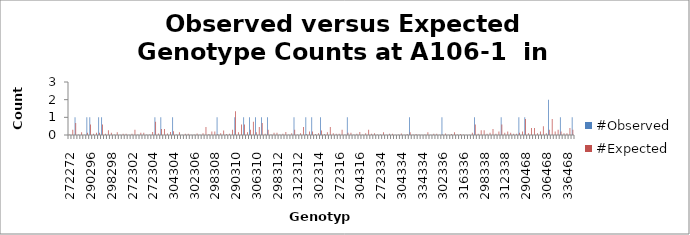
| Category | #Observed | #Expected |
|---|---|---|
| 272272.0 | 0 | 0.033 |
| 272290.0 | 0 | 0.3 |
| 290290.0 | 1 | 0.675 |
| 272294.0 | 0 | 0.033 |
| 290294.0 | 0 | 0.15 |
| 294294.0 | 0 | 0.008 |
| 272296.0 | 1 | 0.133 |
| 290296.0 | 1 | 0.6 |
| 294296.0 | 0 | 0.067 |
| 296296.0 | 0 | 0.133 |
| 272298.0 | 1 | 0.133 |
| 290298.0 | 1 | 0.6 |
| 294298.0 | 0 | 0.067 |
| 296298.0 | 0 | 0.267 |
| 298298.0 | 0 | 0.133 |
| 272300.0 | 0 | 0.033 |
| 290300.0 | 0 | 0.15 |
| 294300.0 | 0 | 0.017 |
| 296300.0 | 0 | 0.067 |
| 298300.0 | 0 | 0.067 |
| 300300.0 | 0 | 0.008 |
| 272302.0 | 0 | 0.067 |
| 290302.0 | 0 | 0.3 |
| 294302.0 | 0 | 0.033 |
| 296302.0 | 0 | 0.133 |
| 298302.0 | 0 | 0.133 |
| 300302.0 | 0 | 0.033 |
| 302302.0 | 0 | 0.033 |
| 272304.0 | 0 | 0.167 |
| 290304.0 | 1 | 0.75 |
| 294304.0 | 0 | 0.083 |
| 296304.0 | 1 | 0.333 |
| 298304.0 | 0 | 0.333 |
| 300304.0 | 0 | 0.083 |
| 302304.0 | 0 | 0.167 |
| 304304.0 | 1 | 0.208 |
| 272306.0 | 0 | 0.033 |
| 290306.0 | 0 | 0.15 |
| 294306.0 | 0 | 0.017 |
| 296306.0 | 0 | 0.067 |
| 298306.0 | 0 | 0.067 |
| 300306.0 | 0 | 0.017 |
| 302306.0 | 0 | 0.033 |
| 304306.0 | 0 | 0.083 |
| 306306.0 | 0 | 0.008 |
| 272308.0 | 0 | 0.1 |
| 290308.0 | 0 | 0.45 |
| 294308.0 | 0 | 0.05 |
| 296308.0 | 0 | 0.2 |
| 298308.0 | 0 | 0.2 |
| 300308.0 | 1 | 0.05 |
| 302308.0 | 0 | 0.1 |
| 304308.0 | 0 | 0.25 |
| 306308.0 | 0 | 0.05 |
| 308308.0 | 0 | 0.075 |
| 272310.0 | 0 | 0.3 |
| 290310.0 | 1 | 1.35 |
| 294310.0 | 0 | 0.15 |
| 296310.0 | 0 | 0.6 |
| 298310.0 | 1 | 0.6 |
| 300310.0 | 0 | 0.15 |
| 302310.0 | 1 | 0.3 |
| 304310.0 | 0 | 0.75 |
| 306310.0 | 1 | 0.15 |
| 308310.0 | 0 | 0.45 |
| 310310.0 | 1 | 0.675 |
| 272312.0 | 0 | 0.067 |
| 290312.0 | 1 | 0.3 |
| 294312.0 | 0 | 0.033 |
| 296312.0 | 0 | 0.133 |
| 298312.0 | 0 | 0.133 |
| 300312.0 | 0 | 0.033 |
| 302312.0 | 0 | 0.067 |
| 304312.0 | 0 | 0.167 |
| 306312.0 | 0 | 0.033 |
| 308312.0 | 0 | 0.1 |
| 310312.0 | 1 | 0.3 |
| 312312.0 | 0 | 0.033 |
| 272314.0 | 0 | 0.1 |
| 290314.0 | 0 | 0.45 |
| 294314.0 | 1 | 0.05 |
| 296314.0 | 0 | 0.2 |
| 298314.0 | 1 | 0.2 |
| 300314.0 | 0 | 0.05 |
| 302314.0 | 0 | 0.1 |
| 304314.0 | 1 | 0.25 |
| 306314.0 | 0 | 0.05 |
| 308314.0 | 0 | 0.15 |
| 310314.0 | 0 | 0.45 |
| 312314.0 | 0 | 0.1 |
| 314314.0 | 0 | 0.075 |
| 272316.0 | 0 | 0.067 |
| 290316.0 | 0 | 0.3 |
| 294316.0 | 0 | 0.033 |
| 296316.0 | 1 | 0.133 |
| 298316.0 | 0 | 0.133 |
| 300316.0 | 0 | 0.033 |
| 302316.0 | 0 | 0.067 |
| 304316.0 | 0 | 0.167 |
| 306316.0 | 0 | 0.033 |
| 308316.0 | 0 | 0.1 |
| 310316.0 | 0 | 0.3 |
| 312316.0 | 0 | 0.067 |
| 314316.0 | 0 | 0.1 |
| 316316.0 | 0 | 0.033 |
| 272334.0 | 0 | 0.033 |
| 290334.0 | 0 | 0.15 |
| 294334.0 | 0 | 0.017 |
| 296334.0 | 0 | 0.067 |
| 298334.0 | 0 | 0.067 |
| 300334.0 | 0 | 0.017 |
| 302334.0 | 0 | 0.033 |
| 304334.0 | 0 | 0.083 |
| 306334.0 | 0 | 0.017 |
| 308334.0 | 0 | 0.05 |
| 310334.0 | 1 | 0.15 |
| 312334.0 | 0 | 0.033 |
| 314334.0 | 0 | 0.05 |
| 316334.0 | 0 | 0.033 |
| 334334.0 | 0 | 0.008 |
| 272336.0 | 0 | 0.033 |
| 290336.0 | 0 | 0.15 |
| 294336.0 | 0 | 0.017 |
| 296336.0 | 0 | 0.067 |
| 298336.0 | 0 | 0.067 |
| 300336.0 | 0 | 0.017 |
| 302336.0 | 1 | 0.033 |
| 304336.0 | 0 | 0.083 |
| 306336.0 | 0 | 0.017 |
| 308336.0 | 0 | 0.05 |
| 310336.0 | 0 | 0.15 |
| 312336.0 | 0 | 0.033 |
| 314336.0 | 0 | 0.05 |
| 316336.0 | 0 | 0.033 |
| 334336.0 | 0 | 0.017 |
| 336336.0 | 0 | 0.008 |
| 272338.0 | 0 | 0.133 |
| 290338.0 | 1 | 0.6 |
| 294338.0 | 0 | 0.067 |
| 296338.0 | 0 | 0.267 |
| 298338.0 | 0 | 0.267 |
| 300338.0 | 0 | 0.067 |
| 302338.0 | 0 | 0.133 |
| 304338.0 | 0 | 0.333 |
| 306338.0 | 0 | 0.067 |
| 308338.0 | 0 | 0.2 |
| 310338.0 | 1 | 0.6 |
| 312338.0 | 0 | 0.133 |
| 314338.0 | 0 | 0.2 |
| 316338.0 | 0 | 0.133 |
| 334338.0 | 0 | 0.067 |
| 336338.0 | 0 | 0.067 |
| 338338.0 | 1 | 0.133 |
| 272468.0 | 0 | 0.2 |
| 290468.0 | 1 | 0.9 |
| 294468.0 | 0 | 0.1 |
| 296468.0 | 0 | 0.4 |
| 298468.0 | 0 | 0.4 |
| 300468.0 | 0 | 0.1 |
| 302468.0 | 0 | 0.2 |
| 304468.0 | 0 | 0.5 |
| 306468.0 | 0 | 0.1 |
| 308468.0 | 2 | 0.3 |
| 310468.0 | 0 | 0.9 |
| 312468.0 | 0 | 0.2 |
| 314468.0 | 0 | 0.3 |
| 316468.0 | 1 | 0.2 |
| 334468.0 | 0 | 0.1 |
| 336468.0 | 0 | 0.1 |
| 338468.0 | 0 | 0.4 |
| 468468.0 | 1 | 0.3 |